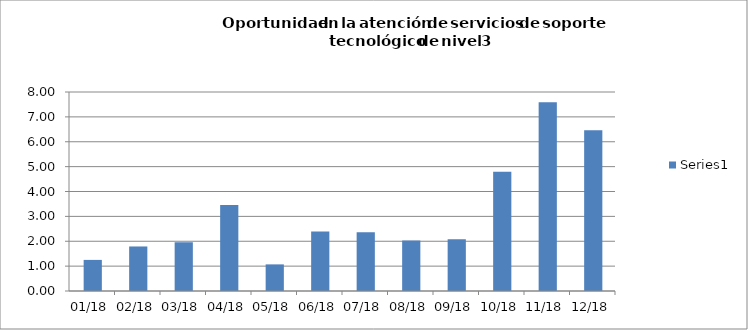
| Category | Series 0 |
|---|---|
| 2018-01-01 | 1.25 |
| 2018-02-01 | 1.79 |
| 2018-03-01 | 1.96 |
| 2018-04-01 | 3.46 |
| 2018-05-01 | 1.07 |
| 2018-06-01 | 2.39 |
| 2018-07-01 | 2.36 |
| 2018-08-01 | 2.03 |
| 2018-09-01 | 2.08 |
| 2018-10-01 | 4.79 |
| 2018-11-01 | 7.59 |
| 2018-12-01 | 6.46 |